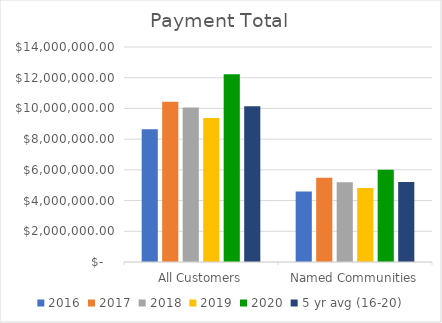
| Category | 2016 | 2017 | 2018 | 2019 | 2020 | 5 yr avg (16-20) |
|---|---|---|---|---|---|---|
|  All Customers  | 8641249.43 | 10430333.47 | 10057123.56 | 9377816.73 | 12232773.29 | 10147859.296 |
|  Named Communities  | 4587960.28 | 5479977.2 | 5186521.58 | 4812850.02 | 6004506.71 | 5214363.158 |